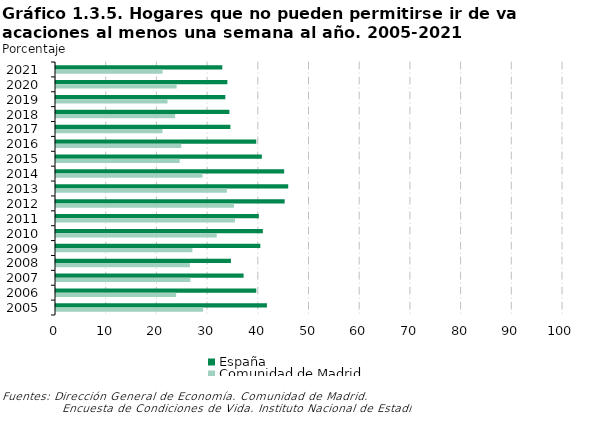
| Category | España | Comunidad de Madrid |
|---|---|---|
| 2021 | 32.8 | 21 |
| 2020 | 33.8 | 23.8 |
| 2019 | 33.4 | 22 |
| 2018 | 34.2 | 23.5 |
| 2017 | 34.4 | 21 |
| 2016 | 39.5 | 24.7 |
| 2015 | 40.6 | 24.4 |
| 2014 | 45 | 28.9 |
| 2013 | 45.8 | 33.7 |
| 2012 | 45.1 | 35.1 |
| 2011 | 40 | 35.3 |
| 2010 | 40.8 | 31.7 |
| 2009 | 40.3 | 26.9 |
| 2008 | 34.5 | 26.4 |
| 2007 | 37 | 26.5 |
| 2006 | 39.5 | 23.7 |
| 2005 | 41.6 | 29 |